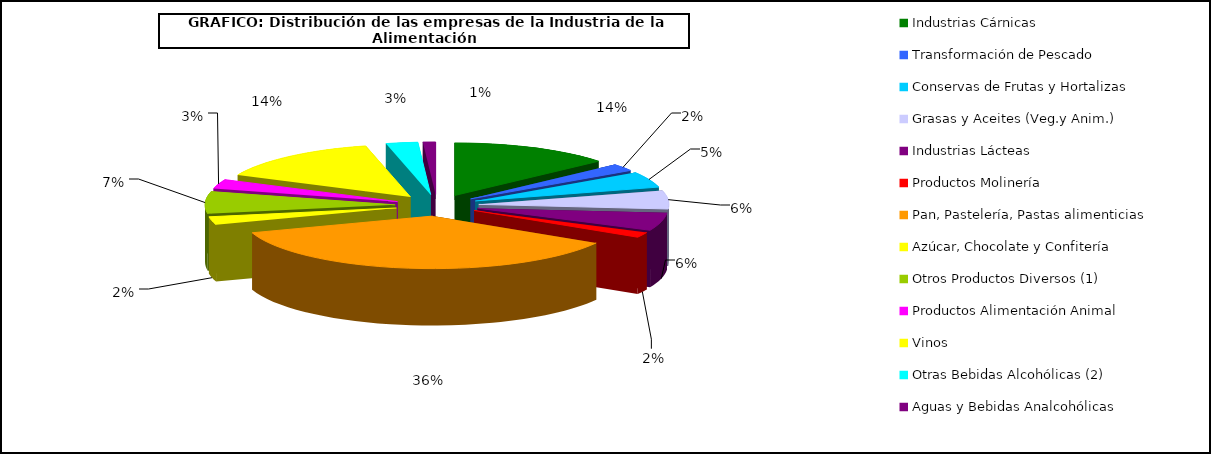
| Category | Series 0 |
|---|---|
| Industrias Cárnicas | 3868 |
| Transformación de Pescado | 625 |
| Conservas de Frutas y Hortalizas   | 1373 |
| Grasas y Aceites (Veg.y Anim.) | 1599 |
| Industrias Lácteas | 1559 |
| Productos Molinería | 457 |
| Pan, Pastelería, Pastas alimenticias | 10272 |
| Azúcar, Chocolate y Confitería | 694 |
| Otros Productos Diversos (1) | 1911 |
| Productos Alimentación Animal | 798 |
| Vinos | 4052 |
| Otras Bebidas Alcohólicas (2) | 766 |
| Aguas y Bebidas Analcohólicas  | 304 |